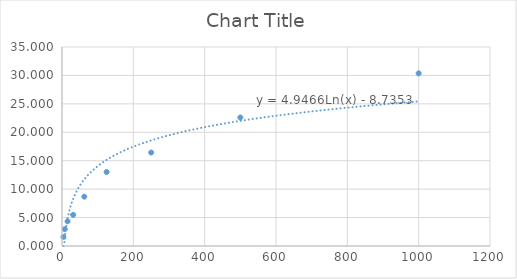
| Category | Series 0 |
|---|---|
| 3.91 | 1.598 |
| 7.81 | 2.968 |
| 15.62 | 4.338 |
| 31.25 | 5.479 |
| 62.5 | 8.676 |
| 125.0 | 13.014 |
| 250.0 | 16.438 |
| 500.0 | 22.603 |
| 1000.0 | 30.365 |